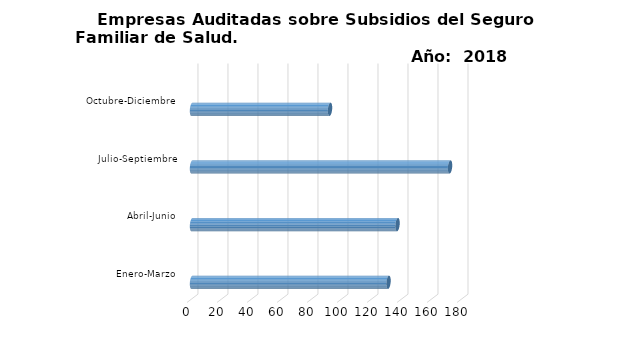
| Category | Empresas Auditadas | Series 1 | Series 2 |
|---|---|---|---|
| Enero-Marzo | 131 |  |  |
| Abril-Junio | 137 |  |  |
| Julio-Septiembre | 172 |  |  |
| Octubre-Diciembre | 92 |  |  |